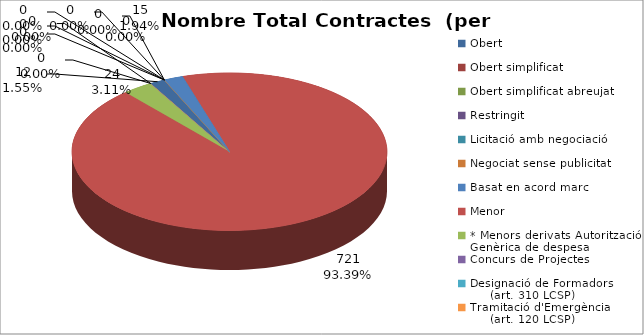
| Category | Nombre Total Contractes |
|---|---|
| Obert | 12 |
| Obert simplificat | 0 |
| Obert simplificat abreujat | 0 |
| Restringit | 0 |
| Licitació amb negociació | 0 |
| Negociat sense publicitat | 0 |
| Basat en acord marc | 15 |
| Menor | 721 |
| * Menors derivats Autorització Genèrica de despesa | 24 |
| Concurs de Projectes | 0 |
| Designació de Formadors
     (art. 310 LCSP) | 0 |
| Tramitació d'Emergència
     (art. 120 LCSP) | 0 |